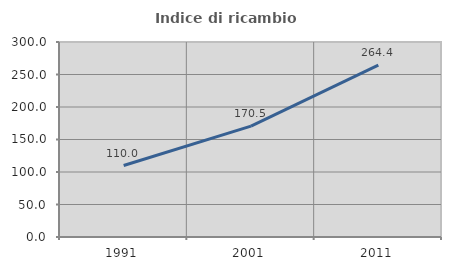
| Category | Indice di ricambio occupazionale  |
|---|---|
| 1991.0 | 109.968 |
| 2001.0 | 170.48 |
| 2011.0 | 264.431 |